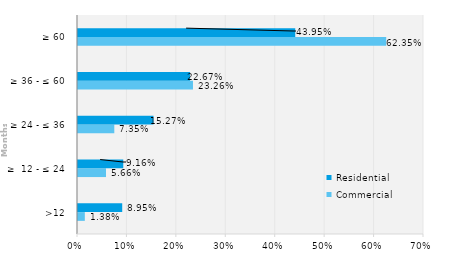
| Category | Commercial | Residential |
|---|---|---|
| >12 | 0.014 | 0.089 |
| ≥  12 - ≤ 24 | 0.057 | 0.092 |
| ≥ 24 - ≤ 36 | 0.073 | 0.153 |
| ≥ 36 - ≤ 60 | 0.233 | 0.227 |
| ≥ 60 | 0.624 | 0.44 |